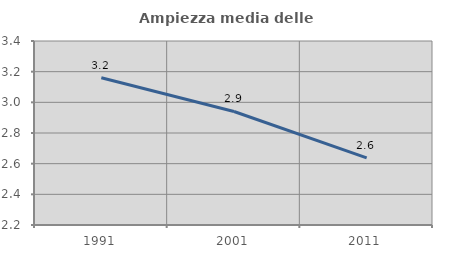
| Category | Ampiezza media delle famiglie |
|---|---|
| 1991.0 | 3.16 |
| 2001.0 | 2.94 |
| 2011.0 | 2.638 |